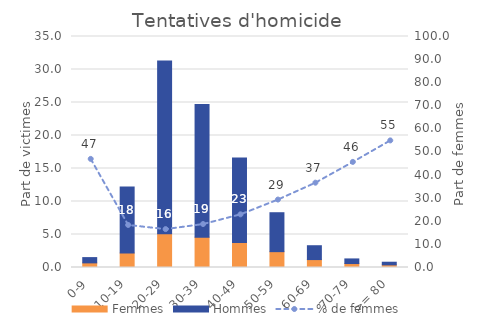
| Category | Femmes | Hommes |
|---|---|---|
| 0 | 0.7 | 0.8 |
| 1 | 2.2 | 10 |
| 2 | 5.1 | 26.2 |
| 3 | 4.6 | 20.1 |
| 4 | 3.8 | 12.8 |
| 5 | 2.4 | 5.9 |
| 6 | 1.2 | 2.1 |
| 7 | 0.6 | 0.7 |
| 8 | 0.4 | 0.4 |